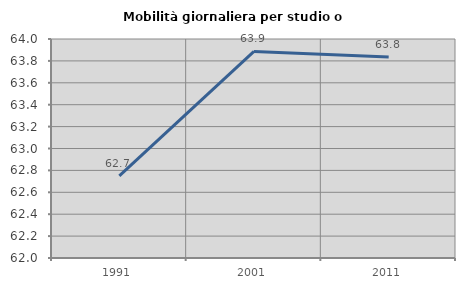
| Category | Mobilità giornaliera per studio o lavoro |
|---|---|
| 1991.0 | 62.749 |
| 2001.0 | 63.887 |
| 2011.0 | 63.835 |